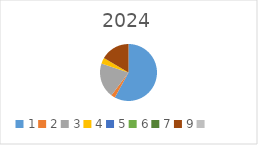
| Category | Series 0 |
|---|---|
| 1.0 | 7030612 |
| 2.0 | 276000 |
| 3.0 | 2410296 |
| 4.0 | 410000 |
| 5.0 | 0 |
| 6.0 | 0 |
| 7.0 | 0 |
| 9.0 | 2001000 |
| nan | 0 |